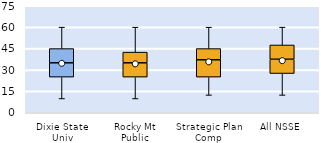
| Category | 25th | 50th | 75th |
|---|---|---|---|
| Dixie State Univ | 25 | 10 | 10 |
| Rocky Mt Public | 25 | 10 | 7.5 |
| Strategic Plan Comp | 25 | 12.143 | 7.857 |
| All NSSE | 27.5 | 10 | 10 |